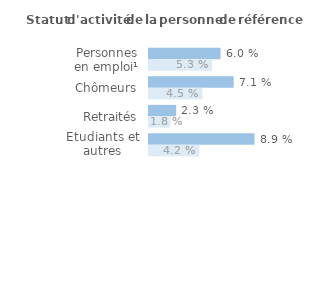
| Category | Series 1 | Series 0 |
|---|---|---|
| Personnes en emploi¹ | 0.06 | 0.053 |
| Chômeurs | 0.071 | 0.045 |
| Retraités | 0.023 | 0.018 |
| Etudiants et autres inactifs | 0.089 | 0.042 |